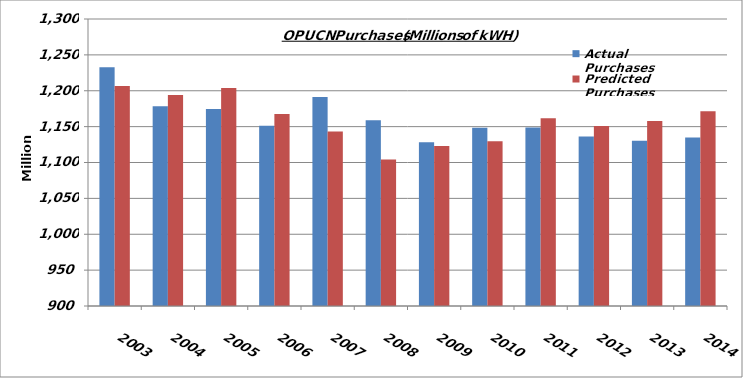
| Category | Actual Purchases | Predicted Purchases |
|---|---|---|
| 2003.0 | 1232724170 | 1206627694.161 |
| 2004.0 | 1178441190 | 1193979451.698 |
| 2005.0 | 1174501350 | 1203979720.134 |
| 2006.0 | 1151360440 | 1167569771.163 |
| 2007.0 | 1191153590 | 1143276288.56 |
| 2008.0 | 1158881926 | 1104122225.661 |
| 2009.0 | 1128390784.511 | 1123059224.089 |
| 2010.0 | 1148489331.815 | 1129587697.951 |
| 2011.0 | 1148632387.395 | 1161830633.495 |
| 2012.0 | 1136211952.671 | 1150989222.193 |
| 2013.0 | 1130407041.667 | 1157767974.988 |
| 2014.0 | 1134970142.773 | 1171374402.739 |